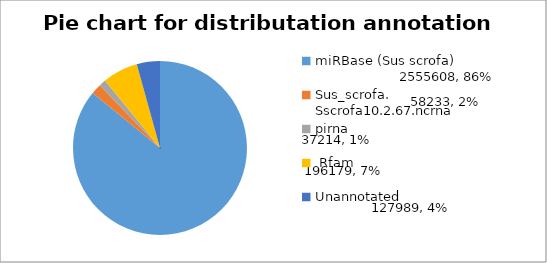
| Category | Series 0 |
|---|---|
| miRBase (Sus scrofa) | 2555608 |
| Sus_scrofa. Sscrofa10.2.67.ncrna | 58233 |
| pirna | 37214 |
|  Rfam | 196179 |
| Unannotated  | 127989 |